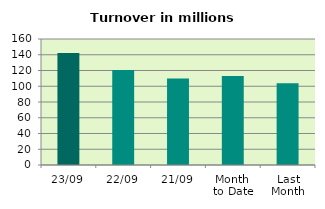
| Category | Series 0 |
|---|---|
| 23/09 | 142.129 |
| 22/09 | 120.536 |
| 21/09 | 109.726 |
| Month 
to Date | 113.043 |
| Last
Month | 103.765 |